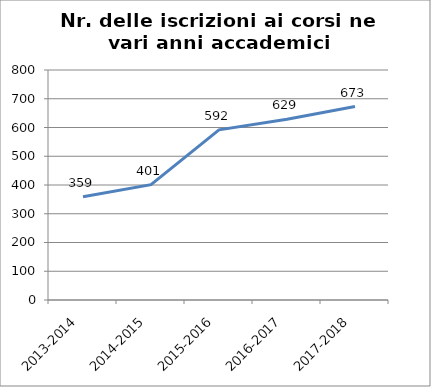
| Category | Nr. Iscrizioni ai Corsi |
|---|---|
| 2013-2014 | 359 |
| 2014-2015 | 401 |
| 2015-2016 | 592 |
| 2016-2017 | 629 |
| 2017-2018 | 673 |